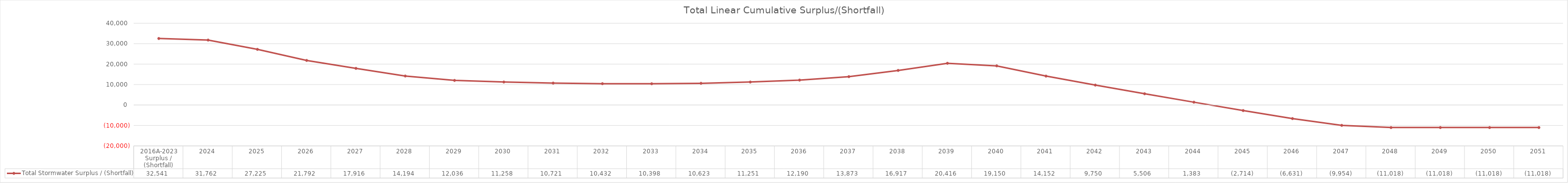
| Category | Total Stormwater Surplus / (Shortfall) |
|---|---|
| 2016A-2023 Surplus / (Shortfall) | 32541.351 |
| 2024 | 31761.948 |
| 2025 | 27225.265 |
| 2026 | 21791.826 |
| 2027 | 17916.185 |
| 2028 | 14194.389 |
| 2029 | 12035.785 |
| 2030 | 11257.527 |
| 2031 | 10721.005 |
| 2032 | 10432.306 |
| 2033 | 10397.642 |
| 2034 | 10623.355 |
| 2035 | 11251.424 |
| 2036 | 12190.343 |
| 2037 | 13873.291 |
| 2038 | 16916.733 |
| 2039 | 20415.958 |
| 2040 | 19149.508 |
| 2041 | 14152.033 |
| 2042 | 9749.679 |
| 2043 | 5505.896 |
| 2044 | 1382.898 |
| 2045 | -2713.655 |
| 2046 | -6630.902 |
| 2047 | -9953.687 |
| 2048 | -11017.633 |
| 2049 | -11017.633 |
| 2050 | -11017.633 |
| 2051 | -11017.633 |